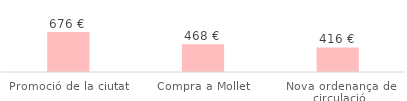
| Category | Total |
|---|---|
| Promoció de la ciutat | 676.39 |
| Compra a Mollet | 468.27 |
| Nova ordenança de circulació | 416.24 |